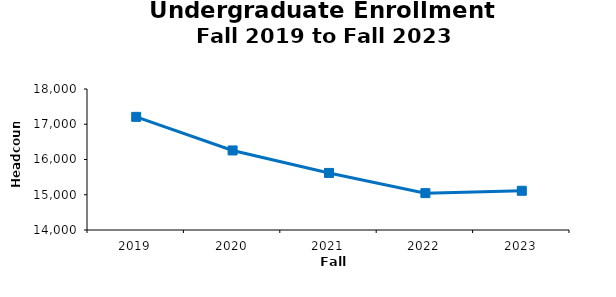
| Category | Series 1 |
|---|---|
| 2019.0 | 17210 |
| 2020.0 | 16257 |
| 2021.0 | 15619 |
| 2022.0 | 15046 |
| 2023.0 | 15113 |